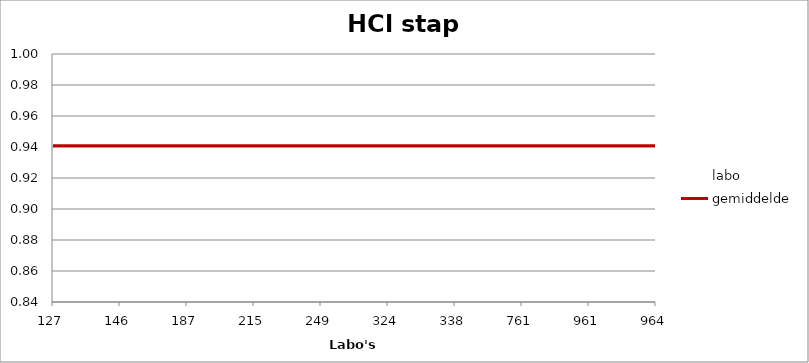
| Category | labo | gemiddelde |
|---|---|---|
| 127.0 | 0.91 | 0.941 |
| 146.0 | 0.93 | 0.941 |
| 187.0 | 0.918 | 0.941 |
| 215.0 | 0.961 | 0.941 |
| 249.0 | 0.944 | 0.941 |
| 324.0 | 0.953 | 0.941 |
| 338.0 | 0.987 | 0.941 |
| 761.0 | 0.901 | 0.941 |
| 961.0 | 0.967 | 0.941 |
| 964.0 | 0.936 | 0.941 |